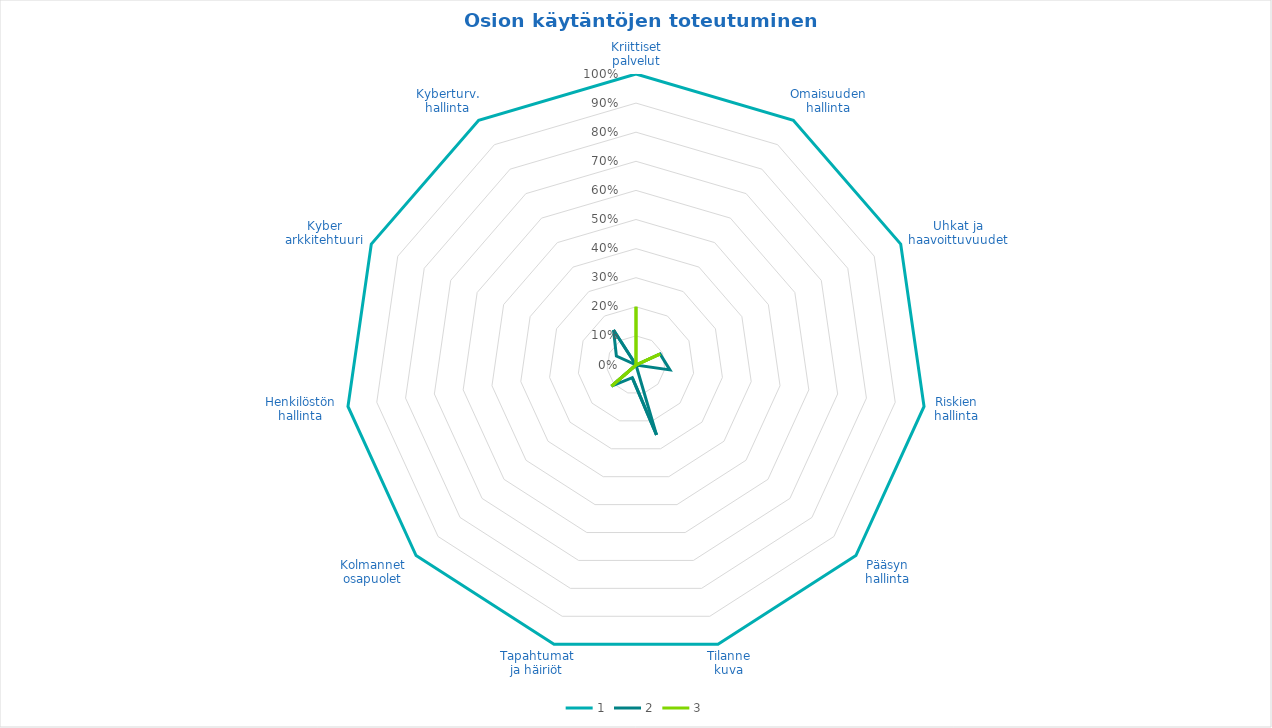
| Category | 1 | 2 | 3 |
|---|---|---|---|
| 0 | 1 | 0 | 0.2 |
| 1 | 1 | 0 | 0 |
| 2 | 1 | 0.091 | 0.091 |
| 3 | 1 | 0.118 | 0 |
| 4 | 1 | 0 | 0 |
| 5 | 1 | 0.25 | 0 |
| 6 | 1 | 0.045 | 0 |
| 7 | 1 | 0.111 | 0.111 |
| 8 | 1 | 0 | 0 |
| 9 | 1 | 0.074 | 0 |
| 10 | 1 | 0.143 | 0 |